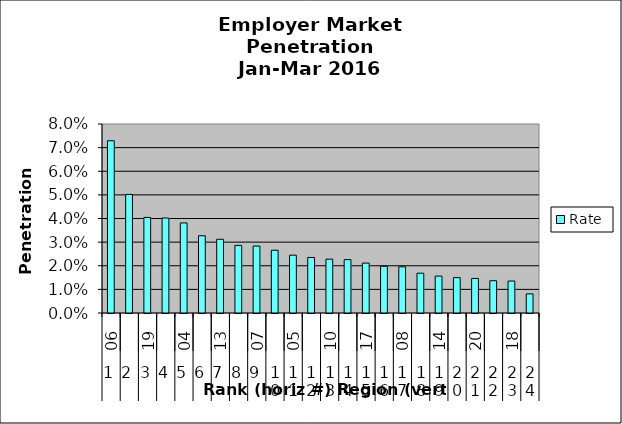
| Category | Rate |
|---|---|
| 0 | 0.073 |
| 1 | 0.05 |
| 2 | 0.04 |
| 3 | 0.04 |
| 4 | 0.038 |
| 5 | 0.033 |
| 6 | 0.031 |
| 7 | 0.029 |
| 8 | 0.028 |
| 9 | 0.027 |
| 10 | 0.024 |
| 11 | 0.024 |
| 12 | 0.023 |
| 13 | 0.023 |
| 14 | 0.021 |
| 15 | 0.02 |
| 16 | 0.02 |
| 17 | 0.017 |
| 18 | 0.016 |
| 19 | 0.015 |
| 20 | 0.015 |
| 21 | 0.014 |
| 22 | 0.014 |
| 23 | 0.008 |